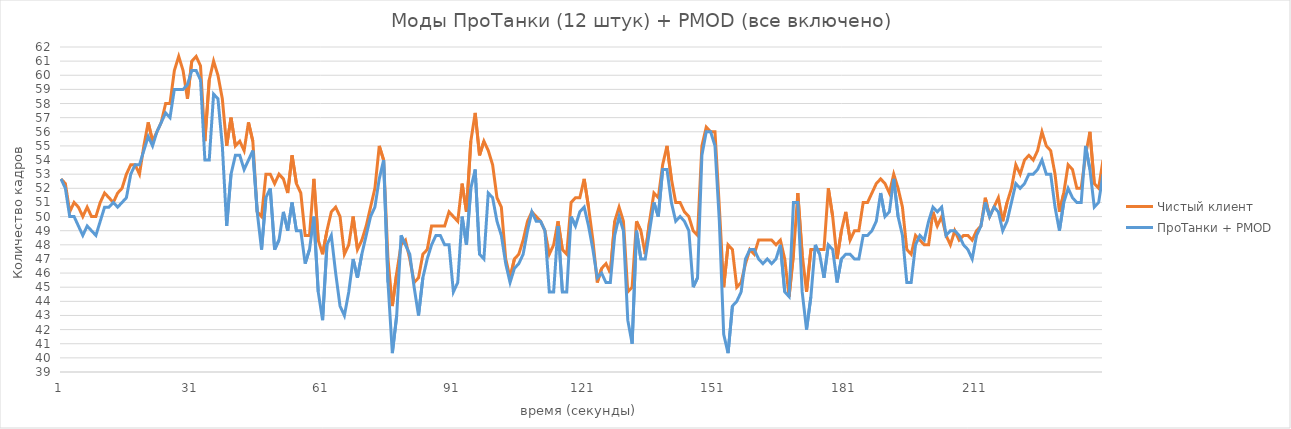
| Category | Чистый клиент | ПроТанки + PMOD |
|---|---|---|
| 0 | 52.667 | 52.667 |
| 1 | 52.333 | 52 |
| 2 | 50.333 | 50 |
| 3 | 51 | 50 |
| 4 | 50.667 | 49.333 |
| 5 | 50 | 48.667 |
| 6 | 50.667 | 49.333 |
| 7 | 50 | 49 |
| 8 | 50 | 48.667 |
| 9 | 51 | 49.667 |
| 10 | 51.667 | 50.667 |
| 11 | 51.333 | 50.667 |
| 12 | 51 | 51 |
| 13 | 51.667 | 50.667 |
| 14 | 52 | 51 |
| 15 | 53 | 51.333 |
| 16 | 53.667 | 53 |
| 17 | 53.667 | 53.667 |
| 18 | 53 | 53.667 |
| 19 | 55 | 54.667 |
| 20 | 56.667 | 55.667 |
| 21 | 55.333 | 55 |
| 22 | 56 | 56 |
| 23 | 56.667 | 56.667 |
| 24 | 58 | 57.333 |
| 25 | 58 | 57 |
| 26 | 60.333 | 59 |
| 27 | 61.333 | 59 |
| 28 | 60.333 | 59 |
| 29 | 58.333 | 59.333 |
| 30 | 61 | 60.333 |
| 31 | 61.333 | 60.333 |
| 32 | 60.667 | 59.667 |
| 33 | 55.333 | 54 |
| 34 | 59.667 | 54 |
| 35 | 61 | 58.667 |
| 36 | 60 | 58.333 |
| 37 | 58.333 | 55 |
| 38 | 55 | 49.333 |
| 39 | 57 | 53 |
| 40 | 55 | 54.333 |
| 41 | 55.333 | 54.333 |
| 42 | 54.667 | 53.333 |
| 43 | 56.667 | 54 |
| 44 | 55.333 | 54.667 |
| 45 | 50.333 | 50.333 |
| 46 | 50 | 47.667 |
| 47 | 53 | 51.333 |
| 48 | 53 | 52 |
| 49 | 52.333 | 47.667 |
| 50 | 53 | 48.333 |
| 51 | 52.667 | 50.333 |
| 52 | 51.667 | 49 |
| 53 | 54.333 | 51 |
| 54 | 52.333 | 49 |
| 55 | 51.667 | 49 |
| 56 | 48.667 | 46.667 |
| 57 | 48.667 | 47.667 |
| 58 | 52.667 | 50 |
| 59 | 48.333 | 44.667 |
| 60 | 47.333 | 42.667 |
| 61 | 49 | 48 |
| 62 | 50.333 | 48.667 |
| 63 | 50.667 | 46 |
| 64 | 50 | 43.667 |
| 65 | 47.333 | 43 |
| 66 | 48 | 44.667 |
| 67 | 50 | 47 |
| 68 | 47.667 | 45.667 |
| 69 | 48.333 | 47.333 |
| 70 | 49.333 | 48.667 |
| 71 | 50.667 | 50 |
| 72 | 52 | 50.667 |
| 73 | 55 | 52.667 |
| 74 | 54 | 54 |
| 75 | 47 | 45.333 |
| 76 | 43.667 | 40.333 |
| 77 | 46 | 43 |
| 78 | 48 | 48.667 |
| 79 | 48.333 | 48 |
| 80 | 47 | 47.333 |
| 81 | 45.333 | 45 |
| 82 | 45.667 | 43 |
| 83 | 47.333 | 45.667 |
| 84 | 47.667 | 47 |
| 85 | 49.333 | 48 |
| 86 | 49.333 | 48.667 |
| 87 | 49.333 | 48.667 |
| 88 | 49.333 | 48 |
| 89 | 50.333 | 48 |
| 90 | 50 | 44.667 |
| 91 | 49.667 | 45.333 |
| 92 | 52.333 | 50 |
| 93 | 50.333 | 48 |
| 94 | 55.333 | 52 |
| 95 | 57.333 | 53.333 |
| 96 | 54.333 | 47.333 |
| 97 | 55.333 | 47 |
| 98 | 54.667 | 51.667 |
| 99 | 53.667 | 51.333 |
| 100 | 51.333 | 49.667 |
| 101 | 50.667 | 48.667 |
| 102 | 47 | 46.667 |
| 103 | 45.667 | 45.333 |
| 104 | 47 | 46.333 |
| 105 | 47.333 | 46.667 |
| 106 | 48.333 | 47.333 |
| 107 | 49.667 | 49 |
| 108 | 50.333 | 50.333 |
| 109 | 50 | 49.667 |
| 110 | 49.667 | 49.667 |
| 111 | 49 | 49 |
| 112 | 47.333 | 44.667 |
| 113 | 48 | 44.667 |
| 114 | 49.667 | 49.333 |
| 115 | 47.667 | 44.667 |
| 116 | 47.333 | 44.667 |
| 117 | 51 | 50 |
| 118 | 51.333 | 49.333 |
| 119 | 51.333 | 50.333 |
| 120 | 52.667 | 50.667 |
| 121 | 50.667 | 49.333 |
| 122 | 48.333 | 47.667 |
| 123 | 45.333 | 45.667 |
| 124 | 46.333 | 46 |
| 125 | 46.667 | 45.333 |
| 126 | 46 | 45.333 |
| 127 | 49.667 | 48.667 |
| 128 | 50.667 | 50 |
| 129 | 49.667 | 49 |
| 130 | 44.667 | 42.667 |
| 131 | 45 | 41 |
| 132 | 49.667 | 49 |
| 133 | 49 | 47 |
| 134 | 47.333 | 47 |
| 135 | 49.667 | 49 |
| 136 | 51.667 | 51 |
| 137 | 51.333 | 50 |
| 138 | 53.667 | 53.333 |
| 139 | 55 | 53.333 |
| 140 | 52.667 | 51 |
| 141 | 51 | 49.667 |
| 142 | 51 | 50 |
| 143 | 50.333 | 49.667 |
| 144 | 50 | 49 |
| 145 | 49 | 45 |
| 146 | 48.667 | 45.667 |
| 147 | 55 | 54.333 |
| 148 | 56.333 | 56 |
| 149 | 56 | 56 |
| 150 | 56 | 55 |
| 151 | 50.667 | 49.667 |
| 152 | 45 | 41.667 |
| 153 | 48 | 40.333 |
| 154 | 47.667 | 43.667 |
| 155 | 45 | 44 |
| 156 | 45.333 | 44.667 |
| 157 | 46.667 | 47 |
| 158 | 47.667 | 47.667 |
| 159 | 47.333 | 47.667 |
| 160 | 48.333 | 47 |
| 161 | 48.333 | 46.667 |
| 162 | 48.333 | 47 |
| 163 | 48.333 | 46.667 |
| 164 | 48 | 47 |
| 165 | 48.333 | 48 |
| 166 | 47 | 44.667 |
| 167 | 44.333 | 44.333 |
| 168 | 47.333 | 51 |
| 169 | 51.667 | 51 |
| 170 | 47.333 | 44.667 |
| 171 | 44.667 | 42 |
| 172 | 47.667 | 44.333 |
| 173 | 47.667 | 48 |
| 174 | 47.667 | 47.333 |
| 175 | 47.667 | 45.667 |
| 176 | 52 | 48 |
| 177 | 50 | 47.667 |
| 178 | 47 | 45.333 |
| 179 | 49 | 47 |
| 180 | 50.333 | 47.333 |
| 181 | 48.333 | 47.333 |
| 182 | 49 | 47 |
| 183 | 49 | 47 |
| 184 | 51 | 48.667 |
| 185 | 51 | 48.667 |
| 186 | 51.667 | 49 |
| 187 | 52.333 | 49.667 |
| 188 | 52.667 | 51.667 |
| 189 | 52.333 | 50 |
| 190 | 51.667 | 50.333 |
| 191 | 53 | 52.667 |
| 192 | 52 | 50 |
| 193 | 50.667 | 48.667 |
| 194 | 47.667 | 45.333 |
| 195 | 47.333 | 45.333 |
| 196 | 48.667 | 48 |
| 197 | 48.333 | 48.667 |
| 198 | 48 | 48.333 |
| 199 | 48 | 49.667 |
| 200 | 50.333 | 50.667 |
| 201 | 49.333 | 50.333 |
| 202 | 50 | 50.667 |
| 203 | 48.667 | 48.667 |
| 204 | 48 | 49 |
| 205 | 49 | 49 |
| 206 | 48.333 | 48.667 |
| 207 | 48.667 | 48 |
| 208 | 48.667 | 47.667 |
| 209 | 48.333 | 47 |
| 210 | 49 | 48.667 |
| 211 | 49.333 | 49.333 |
| 212 | 51.333 | 51 |
| 213 | 50 | 50 |
| 214 | 50.667 | 50.667 |
| 215 | 51.333 | 50.333 |
| 216 | 49.667 | 49 |
| 217 | 51 | 49.667 |
| 218 | 52 | 51 |
| 219 | 53.667 | 52.333 |
| 220 | 53 | 52 |
| 221 | 54 | 52.333 |
| 222 | 54.333 | 53 |
| 223 | 54 | 53 |
| 224 | 54.667 | 53.333 |
| 225 | 56 | 54 |
| 226 | 55 | 53 |
| 227 | 54.667 | 53 |
| 228 | 53 | 50.667 |
| 229 | 50.333 | 49 |
| 230 | 51.667 | 51 |
| 231 | 53.667 | 52 |
| 232 | 53.333 | 51.333 |
| 233 | 52 | 51 |
| 234 | 52 | 51 |
| 235 | 54.333 | 55 |
| 236 | 56 | 53.333 |
| 237 | 52.333 | 50.667 |
| 238 | 52 | 51 |
| 239 | 54 | 53 |